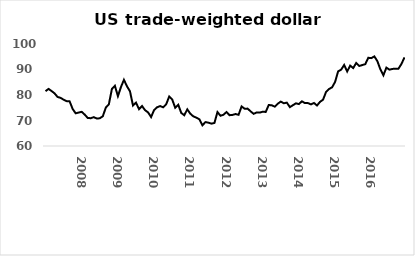
| Category | Series 0 |
|---|---|
| nan | 81.506 |
| nan | 82.39 |
| nan | 81.569 |
| nan | 80.643 |
| nan | 79.23 |
| nan | 78.883 |
| nan | 78.158 |
| nan | 77.599 |
| nan | 77.507 |
| nan | 74.508 |
| nan | 72.814 |
| nan | 73.129 |
| 2008.0 | 73.39 |
| nan | 72.316 |
| nan | 70.986 |
| nan | 70.902 |
| nan | 71.307 |
| nan | 70.781 |
| nan | 70.865 |
| nan | 71.68 |
| nan | 75.081 |
| nan | 76.33 |
| nan | 82.349 |
| nan | 83.61 |
| 2009.0 | 79.553 |
| nan | 83.09 |
| nan | 85.951 |
| nan | 83.416 |
| nan | 81.453 |
| nan | 75.872 |
| nan | 77 |
| nan | 74.445 |
| nan | 75.681 |
| nan | 74.039 |
| nan | 73.176 |
| nan | 71.362 |
| 2010.0 | 74.097 |
| nan | 75.197 |
| nan | 75.654 |
| nan | 75.187 |
| nan | 76.353 |
| nan | 79.39 |
| nan | 78.241 |
| nan | 74.983 |
| nan | 76.175 |
| nan | 72.962 |
| nan | 72.055 |
| nan | 74.372 |
| 2011.0 | 72.669 |
| nan | 71.618 |
| nan | 71.136 |
| nan | 70.475 |
| nan | 68.093 |
| nan | 69.365 |
| nan | 69.151 |
| nan | 68.756 |
| nan | 69.053 |
| nan | 73.307 |
| nan | 71.86 |
| nan | 72.262 |
| 2012.0 | 73.332 |
| nan | 72.076 |
| nan | 72.202 |
| nan | 72.536 |
| nan | 72.242 |
| nan | 75.516 |
| nan | 74.62 |
| nan | 74.662 |
| nan | 73.576 |
| nan | 72.611 |
| nan | 73.17 |
| nan | 73.092 |
| 2013.0 | 73.436 |
| nan | 73.359 |
| nan | 76.072 |
| nan | 75.978 |
| nan | 75.422 |
| nan | 76.603 |
| nan | 77.406 |
| nan | 76.758 |
| nan | 77.004 |
| nan | 75.243 |
| nan | 75.988 |
| nan | 76.726 |
| 2014.0 | 76.436 |
| nan | 77.535 |
| nan | 76.821 |
| nan | 76.829 |
| nan | 76.321 |
| nan | 76.871 |
| nan | 75.882 |
| nan | 77.316 |
| nan | 78.156 |
| nan | 81.21 |
| nan | 82.351 |
| nan | 83.021 |
| 2015.0 | 85.134 |
| nan | 89.272 |
| nan | 89.935 |
| nan | 91.783 |
| nan | 89.229 |
| nan | 91.524 |
| nan | 90.559 |
| nan | 92.564 |
| nan | 91.364 |
| nan | 91.749 |
| nan | 92.094 |
| nan | 94.598 |
| 2016.0 | 94.456 |
| nan | 95.143 |
| nan | 93.312 |
| nan | 90.069 |
| nan | 87.706 |
| nan | 90.738 |
| nan | 89.942 |
| nan | 90.224 |
| nan | 90.336 |
| nan | 90.315 |
| nan | 92.196 |
| nan | 94.761 |